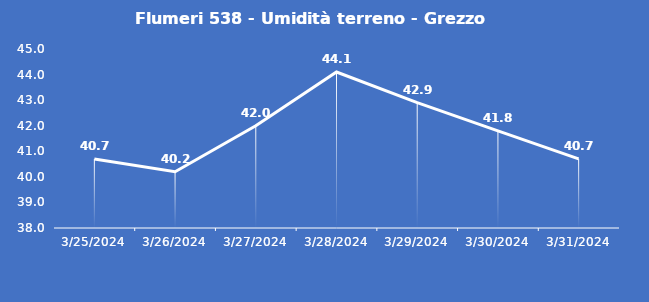
| Category | Flumeri 538 - Umidità terreno - Grezzo (%VWC) |
|---|---|
| 3/25/24 | 40.7 |
| 3/26/24 | 40.2 |
| 3/27/24 | 42 |
| 3/28/24 | 44.1 |
| 3/29/24 | 42.9 |
| 3/30/24 | 41.8 |
| 3/31/24 | 40.7 |